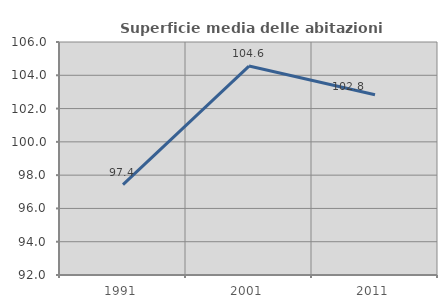
| Category | Superficie media delle abitazioni occupate |
|---|---|
| 1991.0 | 97.435 |
| 2001.0 | 104.554 |
| 2011.0 | 102.831 |